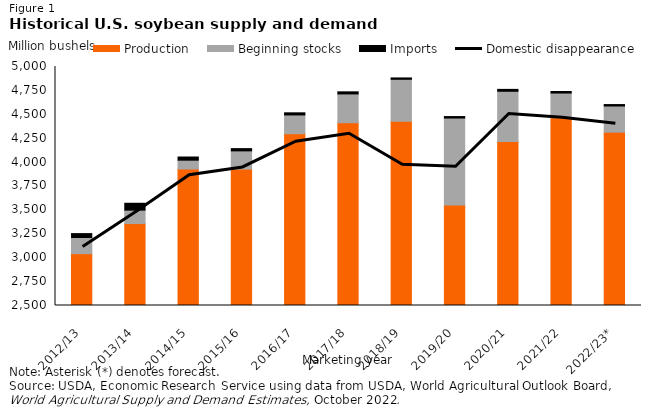
| Category | Production | Beginning stocks | Imports |
|---|---|---|---|
| 2012/13 | 3042.044 | 169.37 | 40.516 |
| 2013/14 | 3357.004 | 140.557 | 71.777 |
| 2014/15 | 3928.07 | 91.991 | 33.225 |
| 2015/16 | 3926.779 | 190.61 | 23.541 |
| 2016/17 | 4296.496 | 196.729 | 22.281 |
| 2017/18 | 4411.633 | 301.595 | 21.811 |
| 2018/19 | 4428.15 | 438.105 | 14.057 |
| 2019/20 | 3551.908 | 909.052 | 15.381 |
| 2020/21 | 4216.302 | 524.541 | 19.815 |
| 2021/22 | 4465.382 | 256.979 | 15.91 |
| 2022/23* | 4313 | 273.756 | 15 |